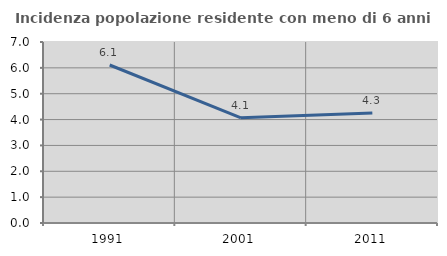
| Category | Incidenza popolazione residente con meno di 6 anni |
|---|---|
| 1991.0 | 6.11 |
| 2001.0 | 4.067 |
| 2011.0 | 4.25 |